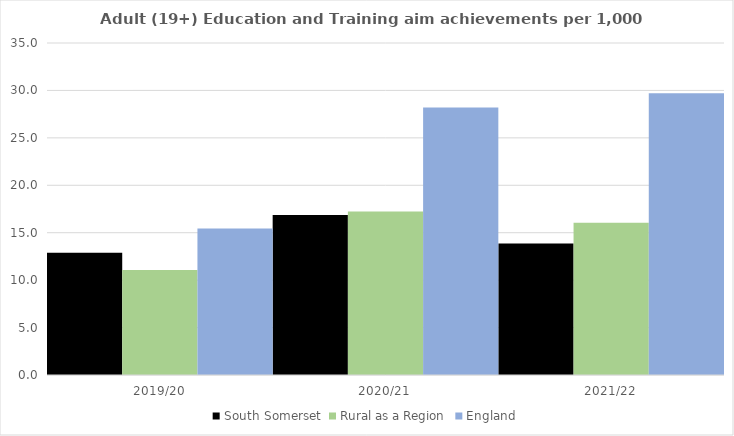
| Category | South Somerset | Rural as a Region | England |
|---|---|---|---|
| 2019/20 | 12.88 | 11.081 | 15.446 |
| 2020/21 | 16.857 | 17.224 | 28.211 |
| 2021/22 | 13.862 | 16.063 | 29.711 |